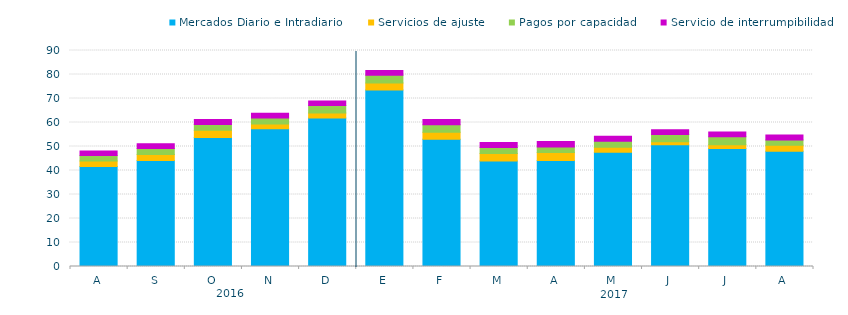
| Category | Mercados Diario e Intradiario  | Servicios de ajuste | Pagos por capacidad | Servicio de interrumpibilidad |
|---|---|---|---|---|
| A | 41.62 | 2.38 | 2.23 | 1.88 |
| S | 44.17 | 2.46 | 2.54 | 1.94 |
| O | 53.78 | 3 | 2.4 | 2.03 |
| N | 57.41 | 1.92 | 2.57 | 1.95 |
| D | 61.87 | 2.04 | 3.17 | 1.88 |
| E | 73.58 | 2.9 | 3.25 | 1.89 |
| F | 53.05 | 2.84 | 3.16 | 2.17 |
| M | 43.94 | 3.12 | 2.51 | 2.06 |
| A | 44.2 | 3.27 | 2.36 | 2.28 |
| M | 47.6 | 2.12 | 2.43 | 2.17 |
| J | 50.77 | 1.25 | 2.93 | 2.01 |
| J | 49.13 | 1.65 | 3.28 | 1.94 |
| A | 48.03 | 2.49 | 2.23 | 1.99 |